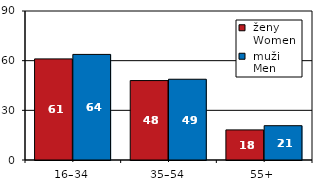
| Category |  ženy 
 Women |  muži 
 Men |
|---|---|---|
| 16–34 | 61.066 | 63.778 |
| 35–54 | 47.974 | 48.776 |
| 55+  | 18.181 | 20.724 |